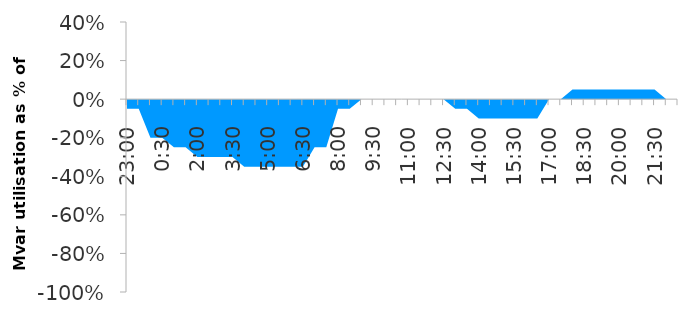
| Category | Series 0 |
|---|---|
| 0.9583333333333334 | -0.05 |
| 0.9791666666666666 | -0.05 |
| 0.0 | -0.2 |
| 0.020833333333333332 | -0.2 |
| 0.041666666666666664 | -0.25 |
| 0.0625 | -0.25 |
| 0.08333333333333333 | -0.3 |
| 0.10416666666666667 | -0.3 |
| 0.125 | -0.3 |
| 0.14583333333333334 | -0.3 |
| 0.16666666666666666 | -0.35 |
| 0.1875 | -0.35 |
| 0.20833333333333334 | -0.35 |
| 0.22916666666666666 | -0.35 |
| 0.25 | -0.35 |
| 0.2708333333333333 | -0.35 |
| 0.2916666666666667 | -0.25 |
| 0.3125 | -0.25 |
| 0.3333333333333333 | -0.05 |
| 0.3541666666666667 | -0.05 |
| 0.375 | 0 |
| 0.3958333333333333 | 0 |
| 0.4166666666666667 | 0 |
| 0.4375 | 0 |
| 0.4583333333333333 | 0 |
| 0.4791666666666667 | 0 |
| 0.5 | 0 |
| 0.5208333333333334 | 0 |
| 0.5416666666666666 | -0.05 |
| 0.5625 | -0.05 |
| 0.5833333333333334 | -0.1 |
| 0.6041666666666666 | -0.1 |
| 0.625 | -0.1 |
| 0.6458333333333334 | -0.1 |
| 0.6666666666666666 | -0.1 |
| 0.6875 | -0.1 |
| 0.7083333333333334 | 0 |
| 0.7291666666666666 | 0 |
| 0.75 | 0.05 |
| 0.7708333333333334 | 0.05 |
| 0.7916666666666666 | 0.05 |
| 0.8125 | 0.05 |
| 0.8333333333333334 | 0.05 |
| 0.8541666666666666 | 0.05 |
| 0.875 | 0.05 |
| 0.8958333333333334 | 0.05 |
| 0.9166666666666666 | 0 |
| 0.9375 | 0 |